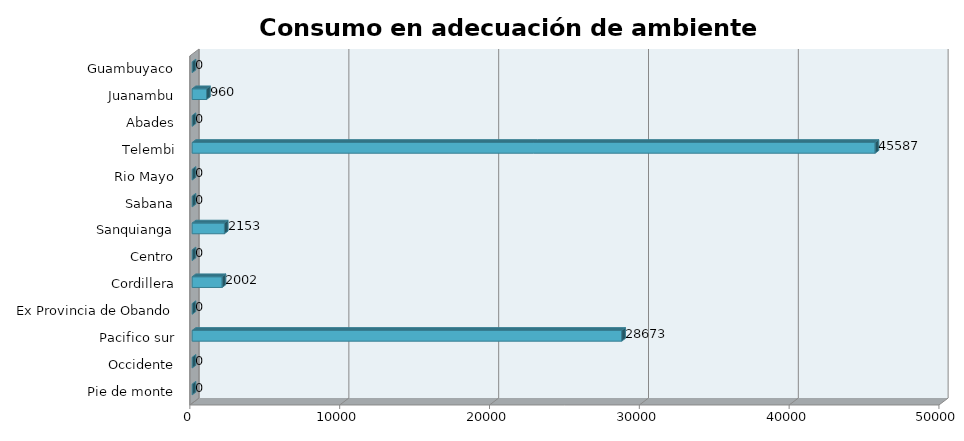
| Category | Series 0 |
|---|---|
| Pie de monte | 0 |
| Occidente | 0 |
| Pacifico sur | 28673.056 |
| Ex Provincia de Obando | 0 |
| Cordillera | 2002.164 |
| Centro | 0 |
| Sanquianga | 2153.394 |
| Sabana | 0 |
| Rio Mayo | 0 |
| Telembi | 45586.789 |
| Abades | 0 |
| Juanambu | 960.239 |
| Guambuyaco | 0 |